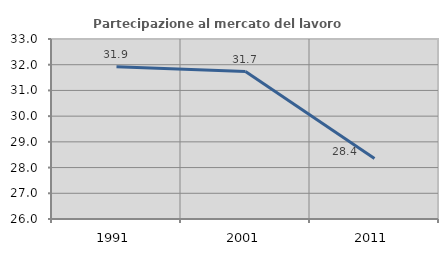
| Category | Partecipazione al mercato del lavoro  femminile |
|---|---|
| 1991.0 | 31.921 |
| 2001.0 | 31.734 |
| 2011.0 | 28.351 |